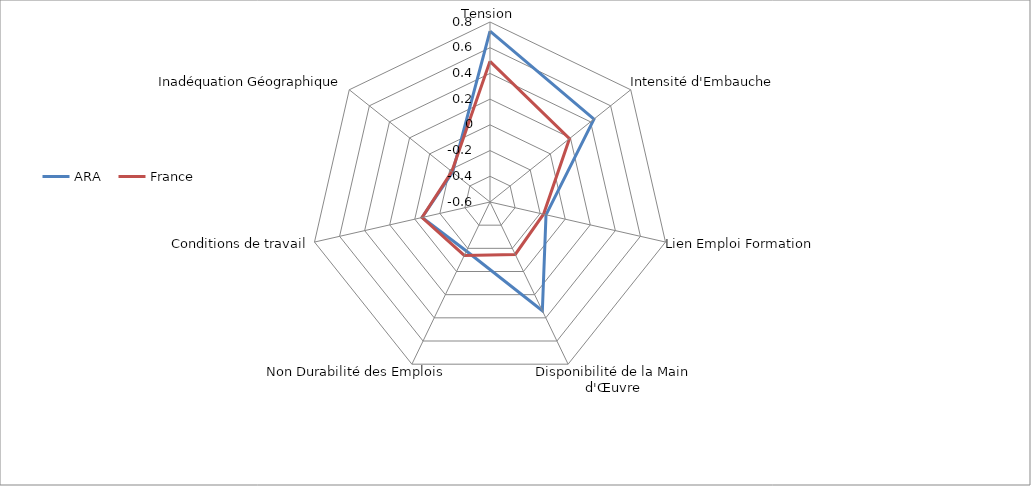
| Category | ARA | France |
|---|---|---|
| Tension | 0.728 | 0.494 |
| Intensité d'Embauche | 0.434 | 0.191 |
| Lien Emploi Formation | -0.153 | -0.173 |
| Disponibilité de la Main d'Œuvre | 0.338 | -0.147 |
| Non Durabilité des Emplois | -0.177 | -0.139 |
| Conditions de travail | -0.058 | -0.058 |
| Inadéquation Géographique | -0.228 | -0.22 |